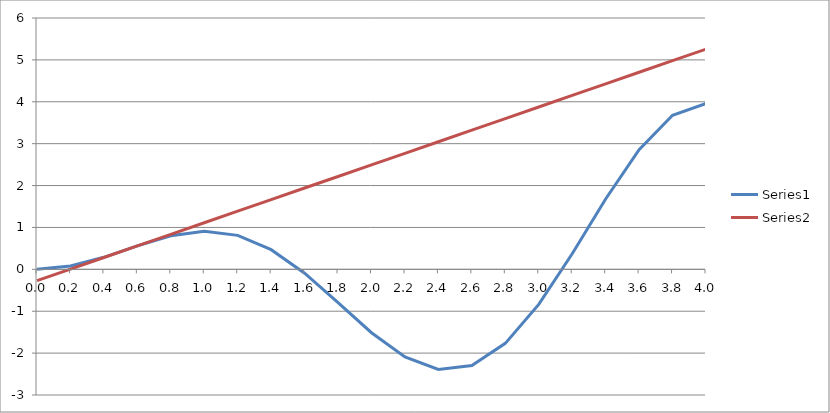
| Category | Series 0 | Series 1 |
|---|---|---|
| 0.0 | 0 | -0.27 |
| 0.2 | 0.078 | 0.006 |
| 0.4 | 0.287 | 0.283 |
| 0.6000000000000001 | 0.559 | 0.559 |
| 0.8 | 0.8 | 0.835 |
| 1.0 | 0.909 | 1.112 |
| 1.2000000000000002 | 0.811 | 1.388 |
| 1.4000000000000001 | 0.469 | 1.664 |
| 1.6 | -0.093 | 1.941 |
| 1.8 | -0.797 | 2.217 |
| 2.0 | -1.514 | 2.493 |
| 2.2 | -2.094 | 2.77 |
| 2.4000000000000004 | -2.391 | 3.046 |
| 2.6 | -2.297 | 3.322 |
| 2.8000000000000003 | -1.768 | 3.599 |
| 3.0 | -0.838 | 3.875 |
| 3.2 | 0.373 | 4.152 |
| 3.4000000000000004 | 1.68 | 4.428 |
| 3.6 | 2.857 | 4.704 |
| 3.8000000000000003 | 3.678 | 4.981 |
| 4.0 | 3.957 | 5.257 |